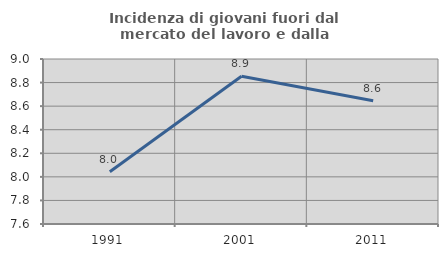
| Category | Incidenza di giovani fuori dal mercato del lavoro e dalla formazione  |
|---|---|
| 1991.0 | 8.043 |
| 2001.0 | 8.853 |
| 2011.0 | 8.646 |